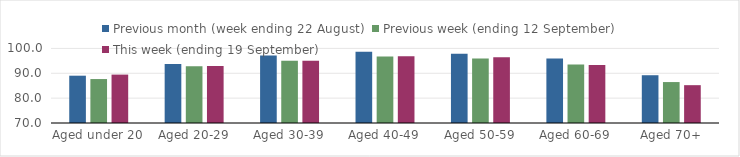
| Category | Previous month (week ending 22 August) | Previous week (ending 12 September) | This week (ending 19 September) |
|---|---|---|---|
| Aged under 20 | 89.03 | 87.68 | 89.47 |
| Aged 20-29 | 93.76 | 92.84 | 92.9 |
| Aged 30-39 | 97.17 | 95.08 | 95.09 |
| Aged 40-49 | 98.68 | 96.76 | 96.9 |
| Aged 50-59 | 97.81 | 95.92 | 96.41 |
| Aged 60-69 | 95.95 | 93.53 | 93.37 |
| Aged 70+ | 89.22 | 86.47 | 85.22 |